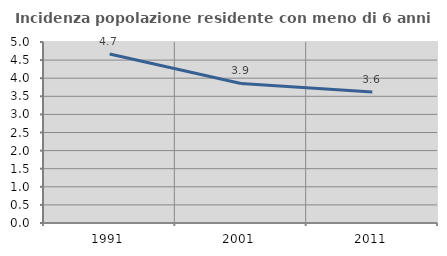
| Category | Incidenza popolazione residente con meno di 6 anni |
|---|---|
| 1991.0 | 4.666 |
| 2001.0 | 3.855 |
| 2011.0 | 3.619 |